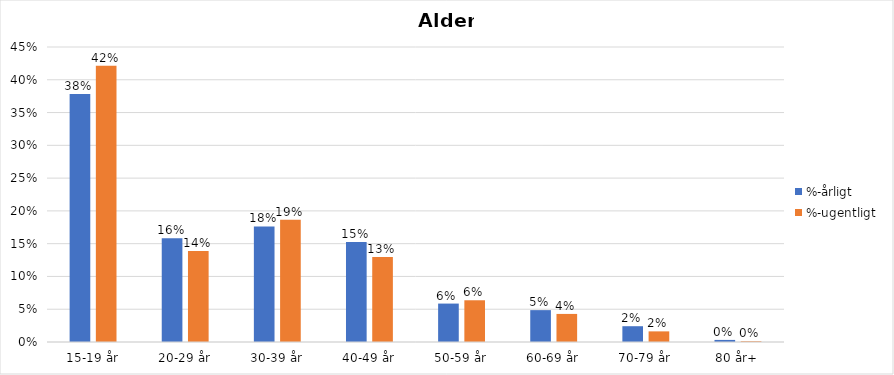
| Category | %-årligt | %-ugentligt |
|---|---|---|
| 15-19 år | 0.378 | 0.421 |
| 20-29 år | 0.158 | 0.139 |
| 30-39 år | 0.176 | 0.186 |
| 40-49 år | 0.153 | 0.13 |
| 50-59 år | 0.059 | 0.064 |
| 60-69 år | 0.049 | 0.043 |
| 70-79 år | 0.024 | 0.016 |
| 80 år+ | 0.003 | 0.001 |